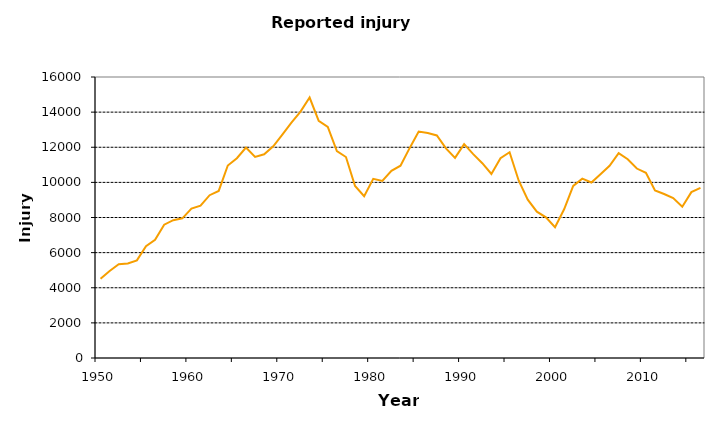
| Category | Series 1 |
|---|---|
| 1950.0 | 4506.62 |
| 1951.0 | 4952 |
| 1952.0 | 5336 |
| 1953.0 | 5377 |
| 1954.0 | 5561 |
| 1955.0 | 6372 |
| 1956.0 | 6736 |
| 1957.0 | 7593 |
| 1958.0 | 7848 |
| 1959.0 | 7952 |
| 1960.0 | 8503 |
| 1961.0 | 8679 |
| 1962.0 | 9270 |
| 1963.0 | 9514 |
| 1964.0 | 10960 |
| 1965.0 | 11377 |
| 1966.0 | 11986 |
| 1967.0 | 11446 |
| 1968.0 | 11600 |
| 1969.0 | 12050 |
| 1970.0 | 12722 |
| 1971.0 | 13404 |
| 1972.0 | 14032 |
| 1973.0 | 14830 |
| 1974.0 | 13497 |
| 1975.0 | 13156 |
| 1976.0 | 11783 |
| 1977.0 | 11443 |
| 1978.0 | 9795 |
| 1979.0 | 9212 |
| 1980.0 | 10204 |
| 1981.0 | 10079 |
| 1982.0 | 10656 |
| 1983.0 | 10951 |
| 1984.0 | 11949 |
| 1985.0 | 12894 |
| 1986.0 | 12806 |
| 1987.0 | 12674 |
| 1988.0 | 11936 |
| 1989.0 | 11395 |
| 1990.0 | 12179 |
| 1991.0 | 11609 |
| 1992.0 | 11093 |
| 1993.0 | 10477 |
| 1994.0 | 11380 |
| 1995.0 | 11718 |
| 1996.0 | 10107 |
| 1997.0 | 9013 |
| 1998.0 | 8334 |
| 1999.0 | 8010 |
| 2000.0 | 7447 |
| 2001.0 | 8470 |
| 2002.0 | 9798 |
| 2003.0 | 10210 |
| 2004.0 | 9992 |
| 2005.0 | 10467 |
| 2006.0 | 10943 |
| 2007.0 | 11667 |
| 2008.0 | 11316 |
| 2009.0 | 10788 |
| 2010.0 | 10549 |
| 2011.0 | 9545 |
| 2012.0 | 9337 |
| 2013.0 | 9109 |
| 2014.0 | 8614 |
| 2015.0 | 9446 |
| 2016.0 | 9682 |